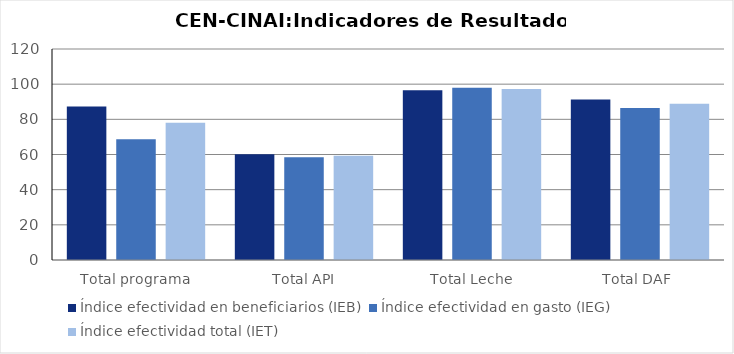
| Category | Índice efectividad en beneficiarios (IEB) | Índice efectividad en gasto (IEG)  | Índice efectividad total (IET) |
|---|---|---|---|
| Total programa | 87.328 | 68.66 | 77.994 |
| Total API | 60.113 | 58.41 | 59.262 |
| Total Leche | 96.539 | 97.924 | 97.231 |
| Total DAF  | 91.318 | 86.464 | 88.891 |